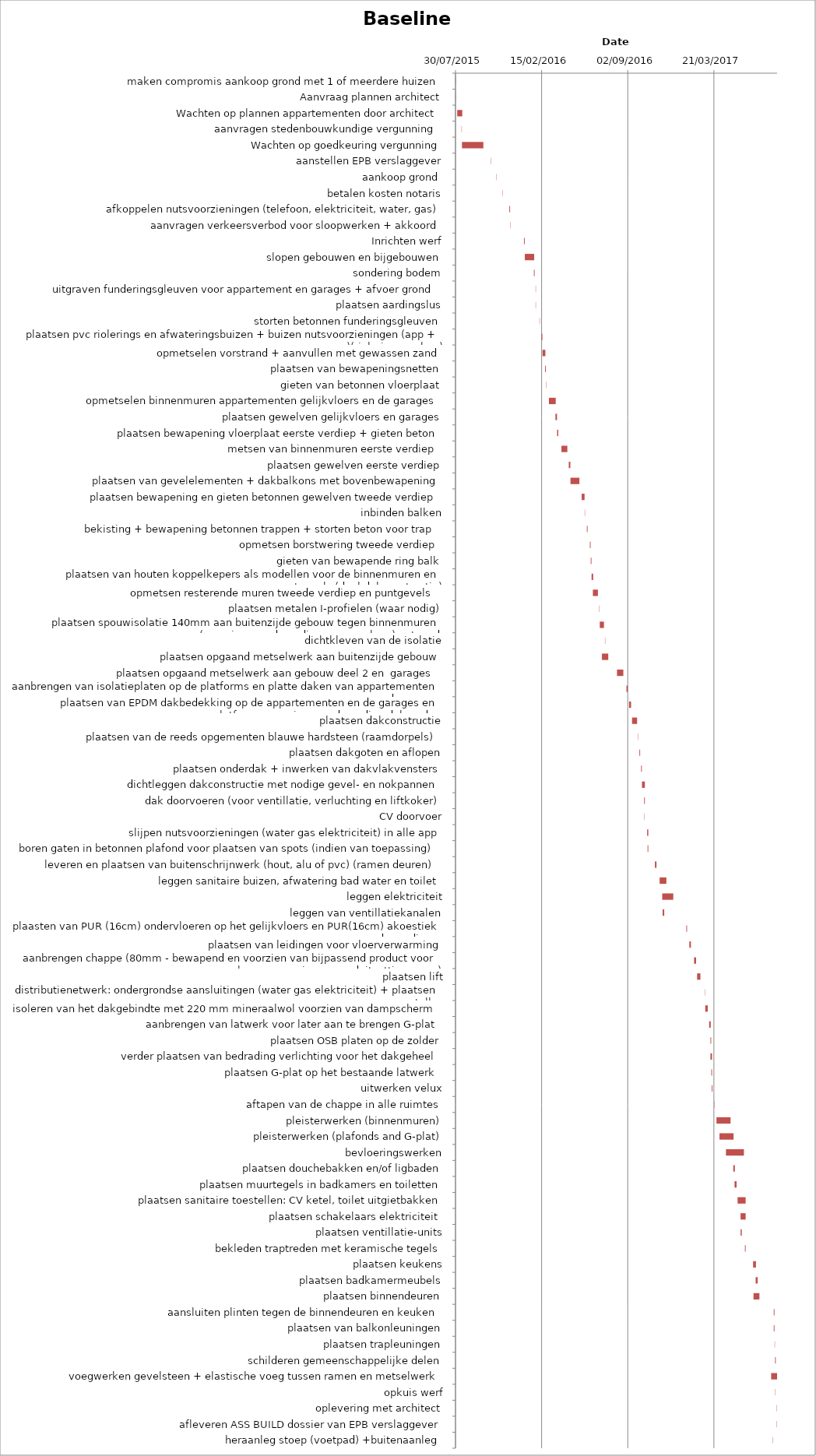
| Category | Baseline start | Actual duration |
|---|---|---|
| maken compromis aankoop grond met 1 of meerdere huizen | 30/07/2015 | 0.708 |
| Aanvraag plannen architect | 31/07/2015 | 0.708 |
| Wachten op plannen appartementen door architect | 03/08/2015 | 11.708 |
| aanvragen stedenbouwkundige vergunning  | 13/08/2015 | 0.708 |
| Wachten op goedkeuring vergunning | 14/08/2015 | 49.708 |
| aanstellen EPB verslaggever | 20/10/2015 | 0.708 |
| aankoop grond  | 02/11/2015 | 0.708 |
| betalen kosten notaris | 16/11/2015 | 0.708 |
| afkoppelen nutsvoorzieningen (telefoon, elektriciteit, water, gas) | 02/12/2015 | 1.708 |
| aanvragen verkeersverbod voor sloopwerken + akkoord | 04/12/2015 | 0.708 |
| Inrichten werf | 05/01/2016 | 1.708 |
| slopen gebouwen en bijgebouwen | 07/01/2016 | 21.708 |
| sondering bodem | 28/01/2016 | 1.708 |
| uitgraven funderingsgleuven voor appartement en garages + afvoer grond | 01/02/2016 | 0.708 |
| plaatsen aardingslus | 01/02/2016 | 0.708 |
| storten betonnen funderingsgleuven | 10/02/2016 | 0.708 |
| plaatsen pvc riolerings en afwateringsbuizen + buizen nutsvoorzieningen (app + garages)(rioleringswerken) | 15/02/2016 | 1.708 |
| opmetselen vorstrand + aanvullen met gewassen zand | 17/02/2016 | 6.708 |
| plaatsen van bewapeningsnetten | 23/02/2016 | 1.708 |
| gieten van betonnen vloerplaat | 25/02/2016 | 0.708 |
| opmetselen binnenmuren appartementen gelijkvloers en de garages | 03/03/2016 | 15.708 |
| plaatsen gewelven gelijkvloers en garages | 18/03/2016 | 3.708 |
| plaatsen bewapening vloerplaat eerste verdiep + gieten beton | 22/03/2016 | 2.708 |
| metsen van binnenmuren eerste verdiep  | 01/04/2016 | 13.708 |
| plaatsen gewelven eerste verdiep | 18/04/2016 | 3.708 |
| plaatsen van gevelelementen + dakbalkons met bovenbewapening | 22/04/2016 | 20.708 |
| plaatsen bewapening en gieten betonnen gewelven tweede verdiep | 18/05/2016 | 6.708 |
| inbinden balken | 25/05/2016 | 0.708 |
| bekisting + bewapening betonnen trappen + storten beton voor trap | 30/05/2016 | 1.708 |
| opmetsen borstwering tweede verdiep  | 06/06/2016 | 1.708 |
| gieten van bewapende ring balk | 08/06/2016 | 1.708 |
| plaatsen van houten koppelkepers als modellen voor de binnenmuren en puntgevels (deel dakconstructie) | 10/06/2016 | 3.708 |
| opmetsen resterende muren tweede verdiep en puntgevels  | 13/06/2016 | 11.708 |
| plaatsen metalen I-profielen (waar nodig) | 27/06/2016 | 0.708 |
| plaatsen spouwisolatie 140mm aan buitenzijde gebouw tegen binnenmuren (voorzien van de nodige spouwankers) getaped | 29/06/2016 | 9.708 |
| dichtkleven van de isolatie | 11/07/2016 | 0.708 |
| plaatsen opgaand metselwerk aan buitenzijde gebouw | 04/07/2016 | 14.708 |
| plaatsen opgaand metselwerk aan gebouw deel 2 en  garages  | 08/08/2016 | 14.708 |
| aanbrengen van isolatieplaten op de platforms en platte daken van appartementen en de garages | 30/08/2016 | 2.708 |
| plaatsen van EPDM dakbedekking op de appartementen en de garages en platforms voorzien van de nodige dakranden | 05/09/2016 | 4.708 |
| plaatsen dakconstructie | 12/09/2016 | 11.708 |
| plaatsen van de reeds opgementen blauwe hardsteen (raamdorpels) | 26/09/2016 | 0.708 |
| plaatsen dakgoten en aflopen | 29/09/2016 | 1.708 |
| plaatsen onderdak + inwerken van dakvlakvensters | 03/10/2016 | 1.708 |
| dichtleggen dakconstructie met nodige gevel- en nokpannen | 05/10/2016 | 6.708 |
| dak doorvoeren (voor ventillatie, verluchting en liftkoker) | 10/10/2016 | 1.708 |
| CV doorvoer | 10/10/2016 | 0.708 |
| slijpen nutsvoorzieningen (water gas elektriciteit) in alle app | 17/10/2016 | 2.708 |
| boren gaten in betonnen plafond voor plaatsen van spots (indien van toepassing) | 18/10/2016 | 1.708 |
| leveren en plaatsen van buitenschrijnwerk (hout, alu of pvc) (ramen deuren) | 04/11/2016 | 3.708 |
| leggen sanitaire buizen, afwatering bad water en toilet | 15/11/2016 | 15.708 |
| leggen elektriciteit | 21/11/2016 | 25.708 |
| leggen van ventillatiekanalen | 22/11/2016 | 3.708 |
| plaasten van PUR (16cm) ondervloeren op het gelijkvloers en PUR(16cm) akoestiek op de verdiepen | 16/01/2017 | 1.708 |
| plaatsen van leidingen voor vloerverwarming | 23/01/2017 | 3.708 |
| aanbrengen chappe (80mm - bewapend en voorzien van bijpassend product voor vloerverwarming en randuitzettingsvoeg) | 03/02/2017 | 4.708 |
| plaatsen lift | 10/02/2017 | 7.708 |
| distributienetwerk: ondergrondse aansluitingen (water gas elektriciteit) + plaatsen tellers | 28/02/2017 | 0.708 |
| isoleren van het dakgebindte met 220 mm mineraalwol voorzien van dampscherm | 01/03/2017 | 5.708 |
| aanbrengen van latwerk voor later aan te brengen G-plat | 10/03/2017 | 3.708 |
| plaatsen OSB platen op de zolder | 13/03/2017 | 1.708 |
| verder plaatsen van bedrading verlichting voor het dakgeheel | 13/03/2017 | 3.708 |
| plaatsen G-plat op het bestaande latwerk  | 15/03/2017 | 1.708 |
| uitwerken velux | 16/03/2017 | 1.708 |
| aftapen van de chappe in alle ruimtes | 22/03/2017 | 0.708 |
| pleisterwerken (binnenmuren) | 27/03/2017 | 32.708 |
| pleisterwerken (plafonds and G-plat) | 03/04/2017 | 32.708 |
| bevloeringswerken | 18/04/2017 | 41.708 |
| plaatsen douchebakken en/of ligbaden | 05/05/2017 | 3.708 |
| plaatsen muurtegels in badkamers en toiletten | 08/05/2017 | 4.708 |
| plaatsen sanitaire toestellen: CV ketel, toilet uitgietbakken | 15/05/2017 | 18.708 |
| plaatsen schakelaars elektriciteit  | 22/05/2017 | 11.708 |
| plaatsen ventillatie-units | 22/05/2017 | 2.708 |
| bekleden traptreden met keramische tegels | 01/06/2017 | 1.708 |
| plaatsen keukens | 20/06/2017 | 6.708 |
| plaatsen badkamermeubels | 26/06/2017 | 4.708 |
| plaatsen binnendeuren | 21/06/2017 | 13.708 |
| aansluiten plinten tegen de binnendeuren en keuken | 07/08/2017 | 1.708 |
| plaatsen van balkonleuningen | 07/08/2017 | 1.708 |
| plaatsen trapleuningen | 09/08/2017 | 0.708 |
| schilderen gemeenschappelijke delen | 10/08/2017 | 1.708 |
| voegwerken gevelsteen + elastische voeg tussen ramen en metselwerk | 01/08/2017 | 13.708 |
| opkuis werf | 10/08/2017 | 0.708 |
| oplevering met architect | 14/08/2017 | 0.708 |
| afleveren ASS BUILD dossier van EPB verslaggever | 14/08/2017 | 0.708 |
| heraanleg stoep (voetpad) +buitenaanleg | 04/08/2017 | 0.708 |